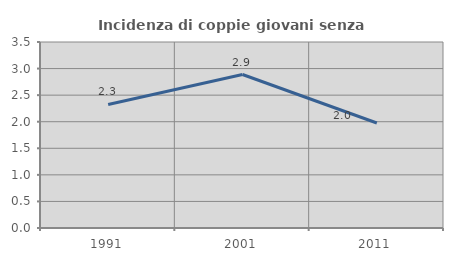
| Category | Incidenza di coppie giovani senza figli |
|---|---|
| 1991.0 | 2.326 |
| 2001.0 | 2.888 |
| 2011.0 | 1.976 |